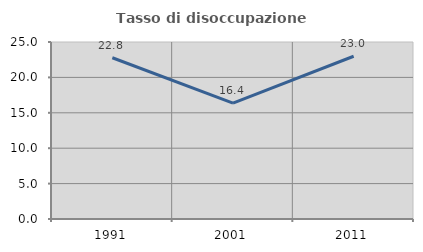
| Category | Tasso di disoccupazione giovanile  |
|---|---|
| 1991.0 | 22.778 |
| 2001.0 | 16.373 |
| 2011.0 | 22.989 |